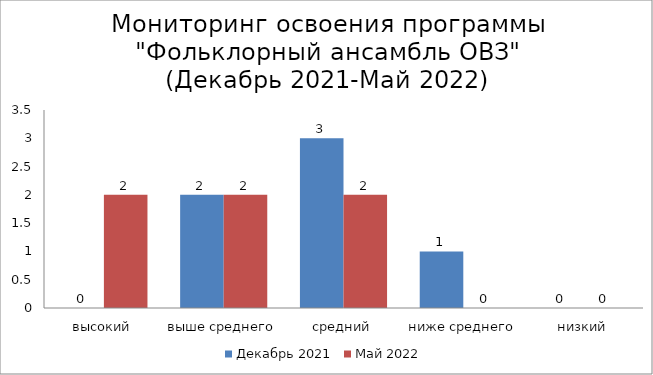
| Category | Декабрь 2021 | Май 2022 |
|---|---|---|
| высокий | 0 | 2 |
| выше среднего | 2 | 2 |
| средний | 3 | 2 |
| ниже среднего | 1 | 0 |
| низкий | 0 | 0 |